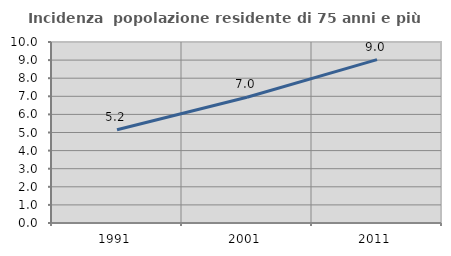
| Category | Incidenza  popolazione residente di 75 anni e più |
|---|---|
| 1991.0 | 5.153 |
| 2001.0 | 6.951 |
| 2011.0 | 9.024 |